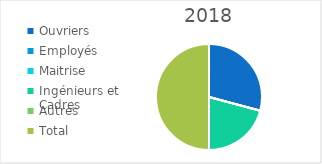
| Category | 2018 |
|---|---|
| Ouvriers | 21 |
| Employés | 0 |
| Maitrise | 0 |
| Ingénieurs et Cadres | 15 |
| Autres | 0 |
| Total | 36 |